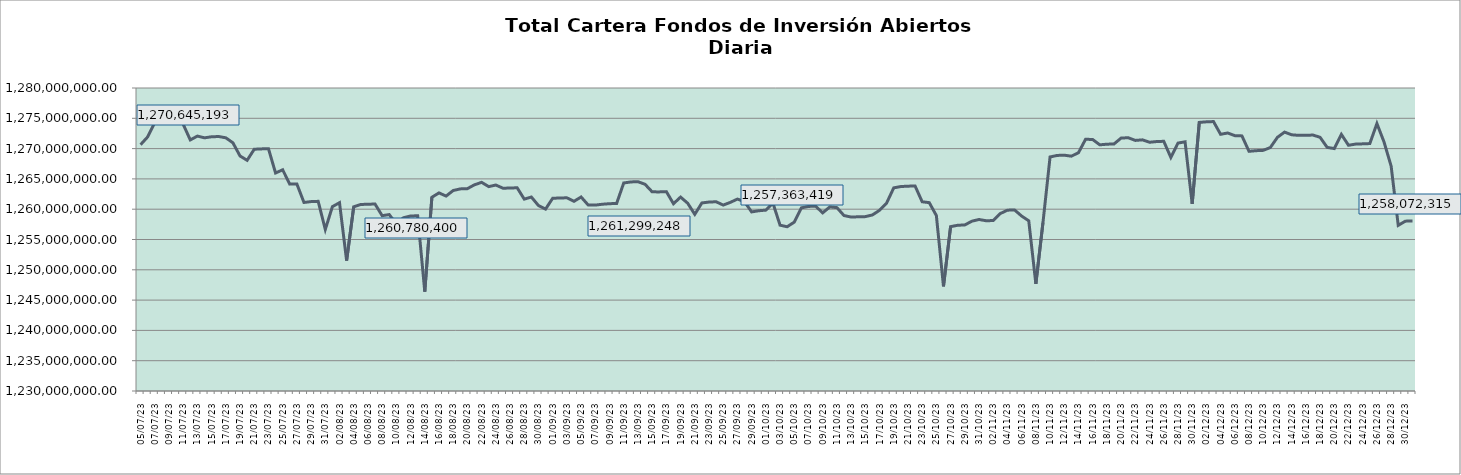
| Category | Cartera |
|---|---|
| 2023-07-05 | 1270645192.678 |
| 2023-07-06 | 1271929500.43 |
| 2023-07-07 | 1274288380.001 |
| 2023-07-08 | 1274354140.995 |
| 2023-07-09 | 1274391295.892 |
| 2023-07-10 | 1275117444.839 |
| 2023-07-11 | 1274011673.649 |
| 2023-07-12 | 1271432224.05 |
| 2023-07-13 | 1272064938.505 |
| 2023-07-14 | 1271778653.2 |
| 2023-07-15 | 1271951860.315 |
| 2023-07-16 | 1271992351.794 |
| 2023-07-17 | 1271781220.021 |
| 2023-07-18 | 1270955306.507 |
| 2023-07-19 | 1268782336.835 |
| 2023-07-20 | 1268069260.083 |
| 2023-07-21 | 1269895972.79 |
| 2023-07-22 | 1269950668.454 |
| 2023-07-23 | 1269989247.115 |
| 2023-07-24 | 1265973711.978 |
| 2023-07-25 | 1266502418.2 |
| 2023-07-26 | 1264138462.141 |
| 2023-07-27 | 1264151959.368 |
| 2023-07-28 | 1261109355.869 |
| 2023-07-29 | 1261256802.887 |
| 2023-07-30 | 1261295181.537 |
| 2023-07-31 | 1256656008.183 |
| 2023-08-01 | 1260422329.788 |
| 2023-08-02 | 1261074429.636 |
| 2023-08-03 | 1251508861.218 |
| 2023-08-04 | 1260394290.142 |
| 2023-08-05 | 1260780399.889 |
| 2023-08-06 | 1260818454.868 |
| 2023-08-07 | 1260856154.31 |
| 2023-08-08 | 1258931682.548 |
| 2023-08-09 | 1259112163.51 |
| 2023-08-10 | 1257567944.667 |
| 2023-08-11 | 1258595024.64 |
| 2023-08-12 | 1258877077.939 |
| 2023-08-13 | 1258917578.564 |
| 2023-08-14 | 1246393238.369 |
| 2023-08-15 | 1261970608.557 |
| 2023-08-16 | 1262690098.335 |
| 2023-08-17 | 1262167544.093 |
| 2023-08-18 | 1263084624.537 |
| 2023-08-19 | 1263351249.193 |
| 2023-08-20 | 1263390978.612 |
| 2023-08-21 | 1264030322.165 |
| 2023-08-22 | 1264428516.004 |
| 2023-08-23 | 1263725802.47 |
| 2023-08-24 | 1263988036.749 |
| 2023-08-25 | 1263465509.934 |
| 2023-08-26 | 1263489358.786 |
| 2023-08-27 | 1263539712.712 |
| 2023-08-28 | 1261664336.014 |
| 2023-08-29 | 1262005720.241 |
| 2023-08-30 | 1260599324.528 |
| 2023-08-31 | 1260019608.382 |
| 2023-09-01 | 1261800669.548 |
| 2023-09-02 | 1261851483.101 |
| 2023-09-03 | 1261878900.5 |
| 2023-09-04 | 1261299248.211 |
| 2023-09-05 | 1262014399.039 |
| 2023-09-06 | 1260688186.448 |
| 2023-09-07 | 1260678948.777 |
| 2023-09-08 | 1260819743.746 |
| 2023-09-09 | 1260908171.874 |
| 2023-09-10 | 1260948548.101 |
| 2023-09-11 | 1264327648.038 |
| 2023-09-12 | 1264498786.81 |
| 2023-09-13 | 1264538866.913 |
| 2023-09-14 | 1264110893.593 |
| 2023-09-15 | 1262863214.526 |
| 2023-09-16 | 1262855240.925 |
| 2023-09-17 | 1262897496.251 |
| 2023-09-18 | 1260905765.406 |
| 2023-09-19 | 1261999784.885 |
| 2023-09-20 | 1260985058.344 |
| 2023-09-21 | 1259152960.718 |
| 2023-09-22 | 1261035301.384 |
| 2023-09-23 | 1261179937.802 |
| 2023-09-24 | 1261227914.666 |
| 2023-09-25 | 1260681130.125 |
| 2023-09-26 | 1261124004.372 |
| 2023-09-27 | 1261672775.292 |
| 2023-09-28 | 1261239583.75 |
| 2023-09-29 | 1259549605.729 |
| 2023-09-30 | 1259744674.342 |
| 2023-10-01 | 1259845168.249 |
| 2023-10-02 | 1260996251.884 |
| 2023-10-03 | 1257363418.97 |
| 2023-10-04 | 1257103036.258 |
| 2023-10-05 | 1257869207.179 |
| 2023-10-06 | 1260222777.995 |
| 2023-10-07 | 1260454300.426 |
| 2023-10-08 | 1260500240.935 |
| 2023-10-09 | 1259397276.835 |
| 2023-10-10 | 1260372194.706 |
| 2023-10-11 | 1260262034.388 |
| 2023-10-12 | 1258951730.707 |
| 2023-10-13 | 1258706251.479 |
| 2023-10-14 | 1258744902.815 |
| 2023-10-15 | 1258774950.409 |
| 2023-10-16 | 1259051636.217 |
| 2023-10-17 | 1259820449.791 |
| 2023-10-18 | 1261019338.029 |
| 2023-10-19 | 1263524972.339 |
| 2023-10-20 | 1263739168.442 |
| 2023-10-21 | 1263798220.965 |
| 2023-10-22 | 1263838931.355 |
| 2023-10-23 | 1261228609.283 |
| 2023-10-24 | 1261080306.794 |
| 2023-10-25 | 1258950365.518 |
| 2023-10-26 | 1247265391.452 |
| 2023-10-27 | 1257118733.98 |
| 2023-10-28 | 1257352064.156 |
| 2023-10-29 | 1257397424.586 |
| 2023-10-30 | 1258024619.477 |
| 2023-10-31 | 1258302049.931 |
| 2023-11-01 | 1258096728.727 |
| 2023-11-02 | 1258128020.793 |
| 2023-11-03 | 1259282594.666 |
| 2023-11-04 | 1259838138.135 |
| 2023-11-05 | 1259879583.054 |
| 2023-11-06 | 1258868757.877 |
| 2023-11-07 | 1258089166.117 |
| 2023-11-08 | 1247665891.164 |
| 2023-11-09 | 1257773034.539 |
| 2023-11-10 | 1268621119.507 |
| 2023-11-11 | 1268873454.842 |
| 2023-11-12 | 1268912090.953 |
| 2023-11-13 | 1268749809.38 |
| 2023-11-14 | 1269328499.486 |
| 2023-11-15 | 1271540597.766 |
| 2023-11-16 | 1271502474.181 |
| 2023-11-17 | 1270622791.458 |
| 2023-11-18 | 1270726399.872 |
| 2023-11-19 | 1270766748.724 |
| 2023-11-20 | 1271738342.978 |
| 2023-11-21 | 1271794603.127 |
| 2023-11-22 | 1271349735.128 |
| 2023-11-23 | 1271444484.916 |
| 2023-11-24 | 1271047149.457 |
| 2023-11-25 | 1271162688.591 |
| 2023-11-26 | 1271203319.113 |
| 2023-11-27 | 1268542954.75 |
| 2023-11-28 | 1270910795.85 |
| 2023-11-29 | 1271120092.6 |
| 2023-11-30 | 1260874049.966 |
| 2023-12-01 | 1274323195.576 |
| 2023-12-02 | 1274418918.284 |
| 2023-12-03 | 1274461870.262 |
| 2023-12-04 | 1272361024.598 |
| 2023-12-05 | 1272576980.438 |
| 2023-12-06 | 1272139155.127 |
| 2023-12-07 | 1272096510.033 |
| 2023-12-08 | 1269552562.266 |
| 2023-12-09 | 1269657780.426 |
| 2023-12-10 | 1269709451.735 |
| 2023-12-11 | 1270179390.842 |
| 2023-12-12 | 1271861504.031 |
| 2023-12-13 | 1272723536.402 |
| 2023-12-14 | 1272279243.907 |
| 2023-12-15 | 1272185322.761 |
| 2023-12-16 | 1272192132.482 |
| 2023-12-17 | 1272237286.648 |
| 2023-12-18 | 1271864970.33 |
| 2023-12-19 | 1270199156.161 |
| 2023-12-20 | 1270006749.592 |
| 2023-12-21 | 1272338455.22 |
| 2023-12-22 | 1270548698.511 |
| 2023-12-23 | 1270743132.58 |
| 2023-12-24 | 1270783573.747 |
| 2023-12-25 | 1270829055.08 |
| 2023-12-26 | 1274137334.261 |
| 2023-12-27 | 1271092503.862 |
| 2023-12-28 | 1267113516.466 |
| 2023-12-29 | 1257332573.979 |
| 2023-12-30 | 1258024927.689 |
| 2023-12-31 | 1258072314.708 |